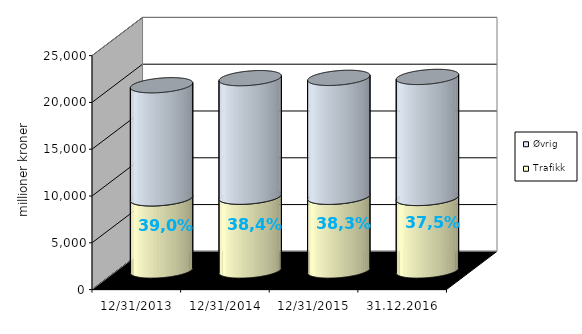
| Category | Trafikk | Øvrig |
|---|---|---|
| 31.12.2013 | 7709.892 | 12083.527 |
| 31.12.2014 | 7884.668 | 12665.925 |
| 31.12.2015 | 7875.825 | 12707.863 |
| 31.12.2016 | 7750.819 | 12931.461 |